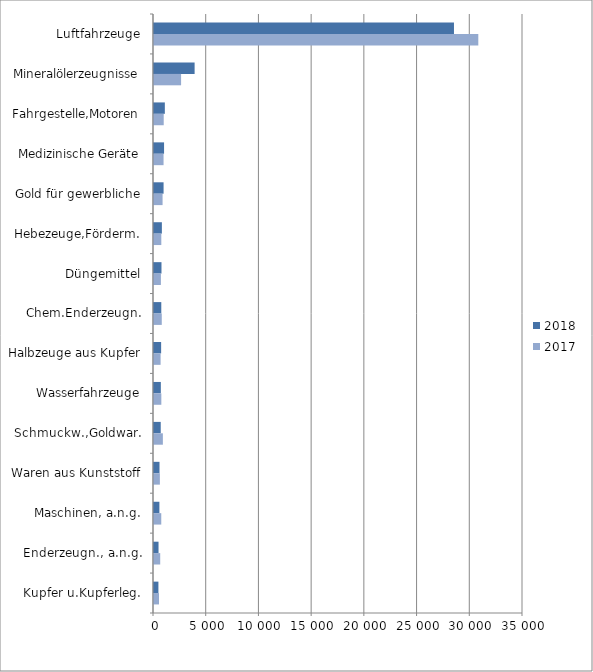
| Category | 2018 | 2017 |
|---|---|---|
| Luftfahrzeuge | 28452.811 | 30760.091 |
| Mineralölerzeugnisse | 3852.251 | 2569.199 |
| Fahrgestelle,Motoren | 1028.226 | 921.425 |
| Medizinische Geräte | 954.287 | 906.611 |
| Gold für gewerbliche | 907.995 | 813.364 |
| Hebezeuge,Förderm. | 747.165 | 693.37 |
| Düngemittel | 709.933 | 654.897 |
| Chem.Enderzeugn. | 691.373 | 736.494 |
| Halbzeuge aus Kupfer | 676.315 | 625.9 |
| Wasserfahrzeuge | 648.943 | 695.345 |
| Schmuckw.,Goldwar. | 638.348 | 841.73 |
| Waren aus Kunststoff | 522.466 | 557.586 |
| Maschinen, a.n.g. | 511.936 | 688.936 |
| Enderzeugn., a.n.g. | 429.253 | 588.96 |
| Kupfer u.Kupferleg. | 418.817 | 472.822 |